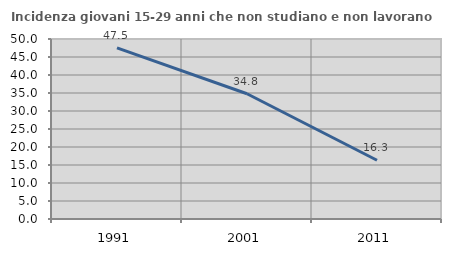
| Category | Incidenza giovani 15-29 anni che non studiano e non lavorano  |
|---|---|
| 1991.0 | 47.525 |
| 2001.0 | 34.783 |
| 2011.0 | 16.327 |